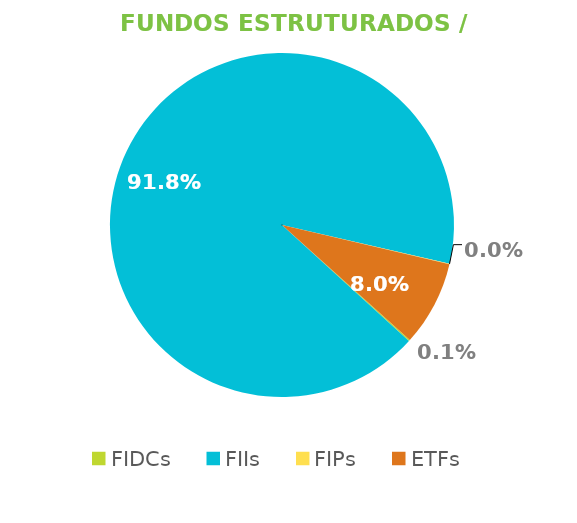
| Category | Fundos Estruturados / ETFs |
|---|---|
| FIDCs | 0.001 |
| FIIs | 0.918 |
| FIPs | 0 |
| ETFs | 0.08 |